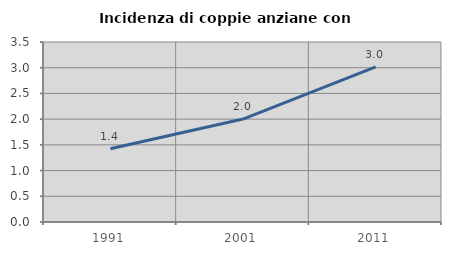
| Category | Incidenza di coppie anziane con figli |
|---|---|
| 1991.0 | 1.423 |
| 2001.0 | 2.002 |
| 2011.0 | 3.015 |